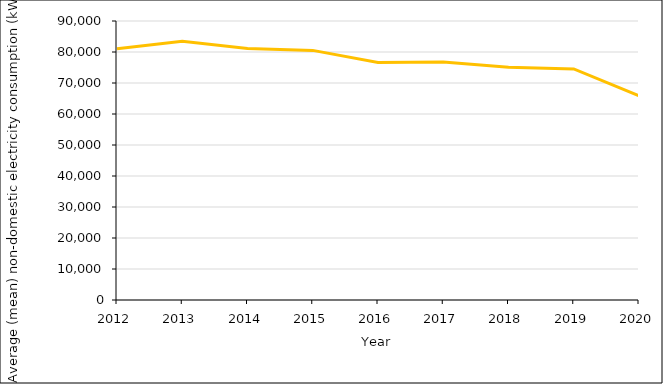
| Category | Mean Non-domestic Consumption (kWh) |
|---|---|
| 2012.0 | 81024 |
| 2013.0 | 83502 |
| 2014.0 | 81115.475 |
| 2015.0 | 80523.001 |
| 2016.0 | 76628.612 |
| 2017.0 | 76779.786 |
| 2018.0 | 75043.635 |
| 2019.0 | 74522.887 |
| 2020.0 | 65905.742 |